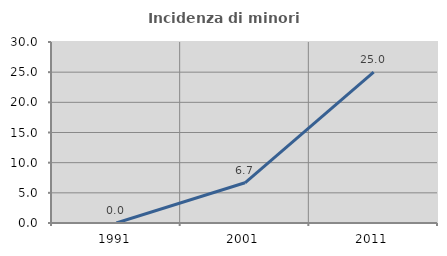
| Category | Incidenza di minori stranieri |
|---|---|
| 1991.0 | 0 |
| 2001.0 | 6.667 |
| 2011.0 | 25 |